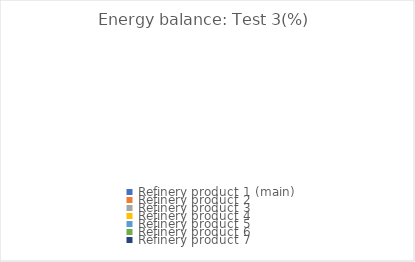
| Category | Series 0 |
|---|---|
| Refinery product 1 (main) | 0 |
| Refinery product 2 | 0 |
| Refinery product 3 | 0 |
| Refinery product 4 | 0 |
| Refinery product 5 | 0 |
| Refinery product 6 | 0 |
| Refinery product 7 | 0 |